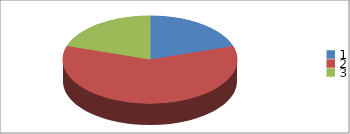
| Category | Series 0 |
|---|---|
| 0 | 2 |
| 1 | 6 |
| 2 | 2 |